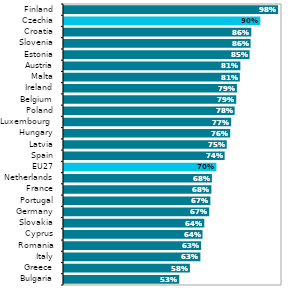
| Category | Series 1 |
|---|---|
| Bulgaria | 0.529 |
| Greece | 0.578 |
| Italy | 0.626 |
| Romania | 0.629 |
| Cyprus | 0.635 |
| Slovakia | 0.644 |
| Germany | 0.666 |
| Portugal | 0.671 |
| France | 0.676 |
| Netherlands | 0.678 |
| EU27 | 0.699 |
| Spain | 0.737 |
| Latvia | 0.747 |
| Hungary | 0.762 |
| Luxembourg  | 0.767 |
| Poland | 0.783 |
| Belgium | 0.79 |
| Ireland | 0.793 |
| Malta | 0.806 |
| Austria | 0.809 |
| Estonia | 0.851 |
| Slovenia | 0.856 |
| Croatia | 0.859 |
| Czechia | 0.901 |
| Finland | 0.982 |